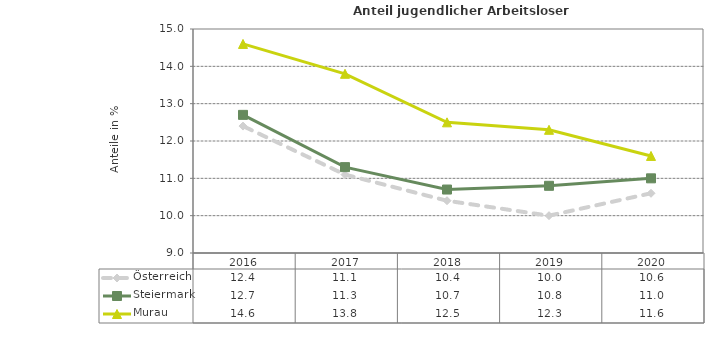
| Category | Österreich | Steiermark | Murau |
|---|---|---|---|
| 2020.0 | 10.6 | 11 | 11.6 |
| 2019.0 | 10 | 10.8 | 12.3 |
| 2018.0 | 10.4 | 10.7 | 12.5 |
| 2017.0 | 11.1 | 11.3 | 13.8 |
| 2016.0 | 12.4 | 12.7 | 14.6 |